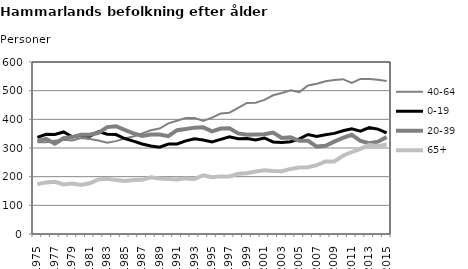
| Category | 40-64 | 0-19 | 20-39 | 65+ |
|---|---|---|---|---|
| 1975.0 | 320 | 337 | 325 | 174 |
| 1976.0 | 320 | 348 | 332 | 180 |
| 1977.0 | 325 | 347 | 315 | 182 |
| 1978.0 | 329 | 356 | 334 | 173 |
| 1979.0 | 326 | 339 | 338 | 176 |
| 1980.0 | 335 | 344 | 346 | 171 |
| 1981.0 | 331 | 341 | 346 | 177 |
| 1982.0 | 326 | 357 | 353 | 190 |
| 1983.0 | 318 | 348 | 373 | 193 |
| 1984.0 | 324 | 347 | 376 | 188 |
| 1985.0 | 333 | 333 | 363 | 185 |
| 1986.0 | 340 | 324 | 351 | 188 |
| 1987.0 | 351 | 314 | 342 | 189 |
| 1988.0 | 362 | 307 | 347 | 198 |
| 1989.0 | 368 | 303 | 347 | 194 |
| 1990.0 | 386 | 314 | 341 | 192 |
| 1991.0 | 395 | 314 | 362 | 190 |
| 1992.0 | 405 | 325 | 366 | 194 |
| 1993.0 | 405 | 332 | 371 | 192 |
| 1994.0 | 394 | 328 | 372 | 205 |
| 1995.0 | 406 | 321 | 358 | 198 |
| 1996.0 | 420 | 330 | 368 | 201 |
| 1997.0 | 423 | 339 | 369 | 201 |
| 1998.0 | 440 | 332 | 351 | 210 |
| 1999.0 | 457 | 333 | 346 | 212 |
| 2000.0 | 458 | 328 | 347 | 218 |
| 2001.0 | 468 | 335 | 348 | 222 |
| 2002.0 | 484 | 321 | 354 | 220 |
| 2003.0 | 492 | 319 | 335 | 219 |
| 2004.0 | 501 | 322 | 337 | 227 |
| 2005.0 | 495 | 332 | 325 | 232 |
| 2006.0 | 518 | 347 | 325 | 233 |
| 2007.0 | 524 | 340 | 305 | 240 |
| 2008.0 | 533 | 346 | 308 | 253 |
| 2009.0 | 537 | 351 | 322 | 253 |
| 2010.0 | 540 | 360 | 335 | 273 |
| 2011.0 | 527 | 367 | 346 | 286 |
| 2012.0 | 541 | 359 | 325 | 297 |
| 2013.0 | 541 | 371 | 317 | 311 |
| 2014.0 | 538 | 366 | 322 | 306 |
| 2015.0 | 534 | 353 | 338 | 312 |